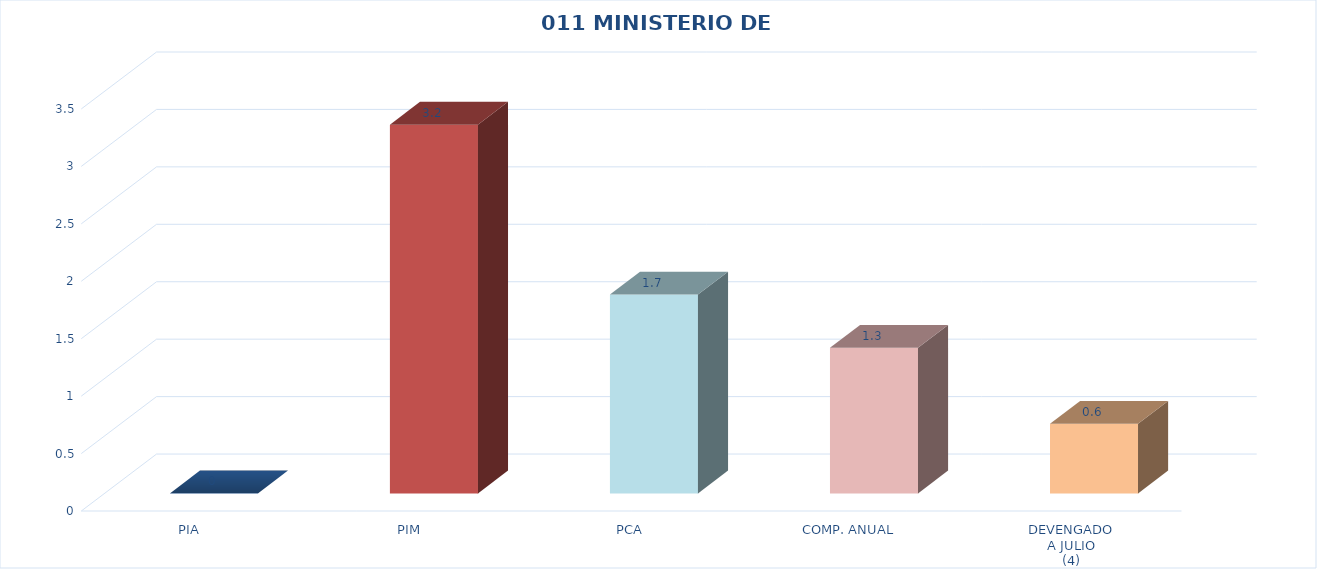
| Category | 011 MINISTERIO DE SALUD |
|---|---|
| PIA | 0 |
| PIM | 3.21 |
| PCA | 1.731 |
| COMP. ANUAL | 1.268 |
| DEVENGADO
A JULIO
(4) | 0.606 |